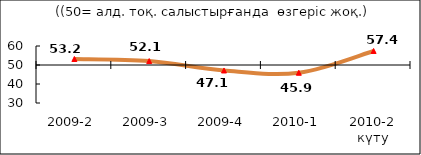
| Category | Диф.индекс ↓ |
|---|---|
| 2009-2 | 53.16 |
| 2009-3 | 52.08 |
| 2009-4 | 47.12 |
| 2010-1 | 45.905 |
| 2010-2 күту | 57.38 |